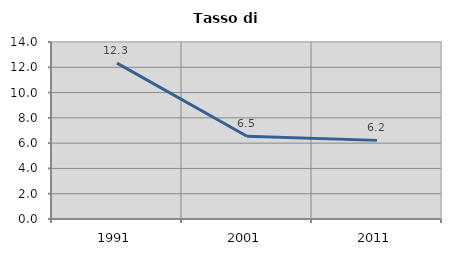
| Category | Tasso di disoccupazione   |
|---|---|
| 1991.0 | 12.326 |
| 2001.0 | 6.546 |
| 2011.0 | 6.219 |